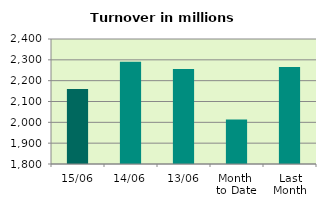
| Category | Series 0 |
|---|---|
| 15/06 | 2160.29 |
| 14/06 | 2290.911 |
| 13/06 | 2255.74 |
| Month 
to Date | 2013.044 |
| Last
Month | 2265.206 |